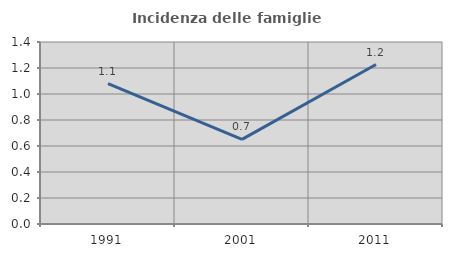
| Category | Incidenza delle famiglie numerose |
|---|---|
| 1991.0 | 1.08 |
| 2001.0 | 0.651 |
| 2011.0 | 1.226 |